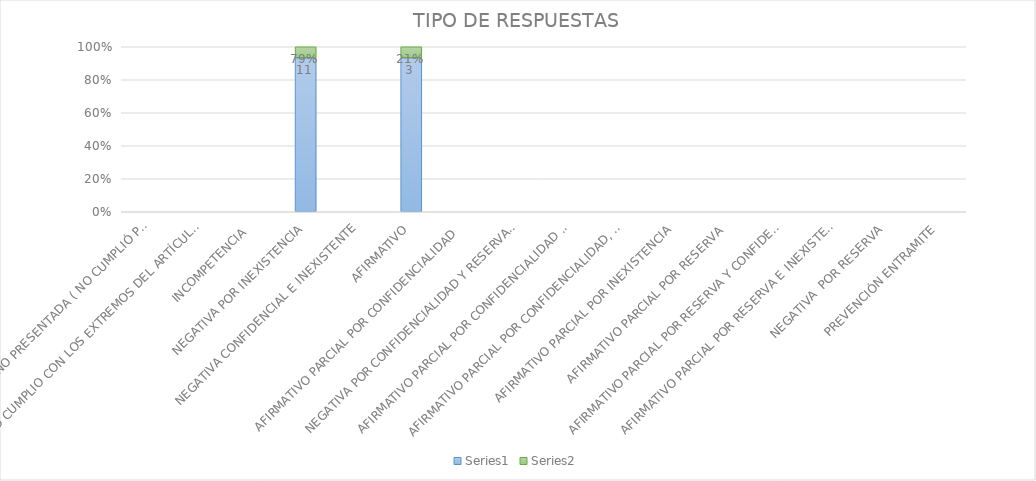
| Category | Series 4 | Series 5 |
|---|---|---|
| SE TIENE POR NO PRESENTADA ( NO CUMPLIÓ PREVENCIÓN) | 0 | 0 |
| NO CUMPLIO CON LOS EXTREMOS DEL ARTÍCULO 79 (REQUISITOS) | 0 | 0 |
| INCOMPETENCIA  | 0 | 0 |
| NEGATIVA POR INEXISTENCIA | 11 | 0.786 |
| NEGATIVA CONFIDENCIAL E INEXISTENTE | 0 | 0 |
| AFIRMATIVO | 3 | 0.214 |
| AFIRMATIVO PARCIAL POR CONFIDENCIALIDAD  | 0 | 0 |
| NEGATIVA POR CONFIDENCIALIDAD Y RESERVADA | 0 | 0 |
| AFIRMATIVO PARCIAL POR CONFIDENCIALIDAD E INEXISTENCIA | 0 | 0 |
| AFIRMATIVO PARCIAL POR CONFIDENCIALIDAD, RESERVA E INEXISTENCIA | 0 | 0 |
| AFIRMATIVO PARCIAL POR INEXISTENCIA | 0 | 0 |
| AFIRMATIVO PARCIAL POR RESERVA | 0 | 0 |
| AFIRMATIVO PARCIAL POR RESERVA Y CONFIDENCIALIDAD | 0 | 0 |
| AFIRMATIVO PARCIAL POR RESERVA E INEXISTENCIA | 0 | 0 |
| NEGATIVA  POR RESERVA | 0 | 0 |
| PREVENCIÓN ENTRAMITE | 0 | 0 |